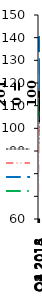
| Category | Series 0 | Series 1 | Series 2 | Series 3 | Series 4 |
|---|---|---|---|---|---|
| Q3 2013 | 108.661 | 117.398 | 134.226 | 105.669 | 113.634 |
| Q4 2013 | 103.104 | 112.286 | 140.181 | 109.423 | 115.675 |
| Q1 2014 | 106.375 | 110.704 | 137.015 | 112.166 | 116.445 |
| Q2 2014 | 116.992 | 108.938 | 120.956 | 112.39 | 113.632 |
| Q3 2014 | 114.931 | 105.876 | 109.319 | 109.184 | 108.868 |
| Q4 2014 | 93.144 | 90.742 | 126.499 | 111.919 | 109.877 |
| Q1 2015 | 92.607 | 72.586 | 122.365 | 112.524 | 107.259 |
| Q2 2015 | 98.18 | 74.063 | 111.528 | 110.086 | 104.277 |
| Q3 2015 | 92.507 | 69.544 | 103.296 | 110.381 | 102.062 |